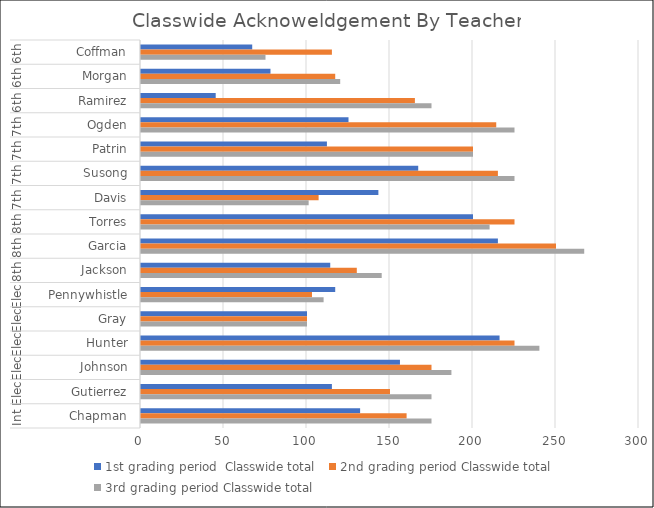
| Category | 1st grading period  | 2nd grading period | 3rd grading period |
|---|---|---|---|
| 0 | 67 | 115 | 75 |
| 1 | 78 | 117 | 120 |
| 2 | 45 | 165 | 175 |
| 3 | 125 | 214 | 225 |
| 4 | 112 | 200 | 200 |
| 5 | 167 | 215 | 225 |
| 6 | 143 | 107 | 101 |
| 7 | 200 | 225 | 210 |
| 8 | 215 | 250 | 267 |
| 9 | 114 | 130 | 145 |
| 10 | 117 | 103 | 110 |
| 11 | 100 | 100 | 100 |
| 12 | 216 | 225 | 240 |
| 13 | 156 | 175 | 187 |
| 14 | 115 | 150 | 175 |
| 15 | 132 | 160 | 175 |